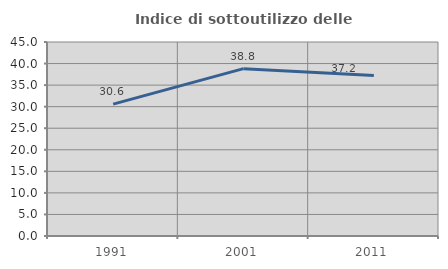
| Category | Indice di sottoutilizzo delle abitazioni  |
|---|---|
| 1991.0 | 30.59 |
| 2001.0 | 38.815 |
| 2011.0 | 37.224 |